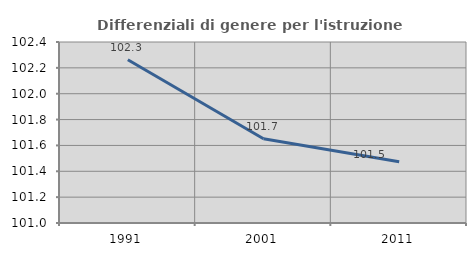
| Category | Differenziali di genere per l'istruzione superiore |
|---|---|
| 1991.0 | 102.263 |
| 2001.0 | 101.652 |
| 2011.0 | 101.474 |